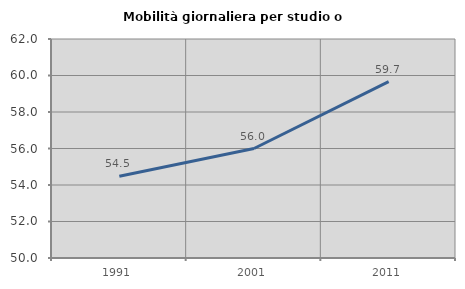
| Category | Mobilità giornaliera per studio o lavoro |
|---|---|
| 1991.0 | 54.483 |
| 2001.0 | 56 |
| 2011.0 | 59.664 |